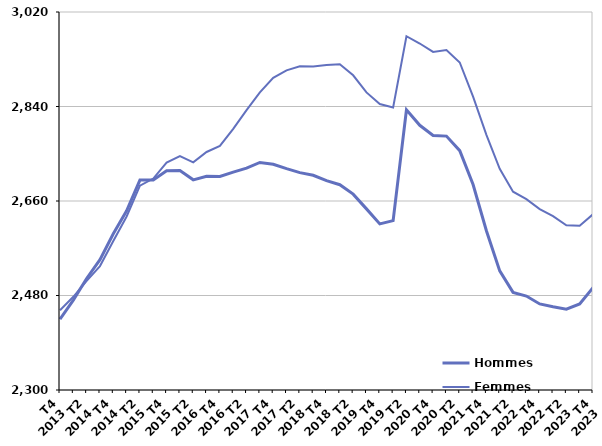
| Category | Hommes  | Femmes  |
|---|---|---|
| T4
2013 | 2434.9 | 2451.9 |
| T1
2014 | 2471.3 | 2477.5 |
| T2
2014 | 2512.4 | 2507.9 |
| T3
2014 | 2548.3 | 2536.1 |
| T4
2014 | 2597.6 | 2583.9 |
| T1
2015 | 2641.3 | 2630.5 |
| T2
2015 | 2699.8 | 2689.1 |
| T3
2015 | 2700.1 | 2702.7 |
| T4
2015 | 2717.5 | 2733 |
| T1
2016 | 2718.2 | 2745.5 |
| T2
2016 | 2700.3 | 2733.7 |
| T3
2016 | 2707.2 | 2753.4 |
| T4
2016 | 2706.6 | 2764.8 |
| T1
2017 | 2714.9 | 2797.4 |
| T2
2017 | 2722.5 | 2833.1 |
| T3
2017 | 2733.4 | 2866.9 |
| T4
2017 | 2730 | 2894.7 |
| T1
2018 | 2721.6 | 2908.9 |
| T2
2018 | 2714.1 | 2916.5 |
| T3
2018 | 2709 | 2916 |
| T4
2018 | 2698.8 | 2919 |
| T1
2019 | 2691 | 2920.3 |
| T2
2019 | 2673.1 | 2899.4 |
| T3
2019 | 2645 | 2866.8 |
| T4
2019 | 2616.4 | 2844.6 |
| T1
2020 | 2622.7 | 2838.1 |
| T2
2020 | 2833.6 | 2973.9 |
| T3
2020 | 2804.2 | 2960 |
| T4
2020 | 2784.9 | 2943.9 |
| T1
2021 | 2783.6 | 2947.5 |
| T2
2021 | 2755.9 | 2923.9 |
| T3
2021 | 2691.4 | 2858.8 |
| T4
2021 | 2603.4 | 2786 |
| T1
2022 | 2526.9 | 2721.2 |
| T2
2022 | 2485.9 | 2677.8 |
| T3
2022 | 2478.9 | 2663.4 |
| T4
2022 | 2463.9 | 2644.7 |
| T1
2023 | 2458.6 | 2631 |
| T2
2023 | 2453.9 | 2613.8 |
| T3
2023 | 2463.8 | 2612.9 |
| T4
2023 | 2494.9 | 2634.7 |